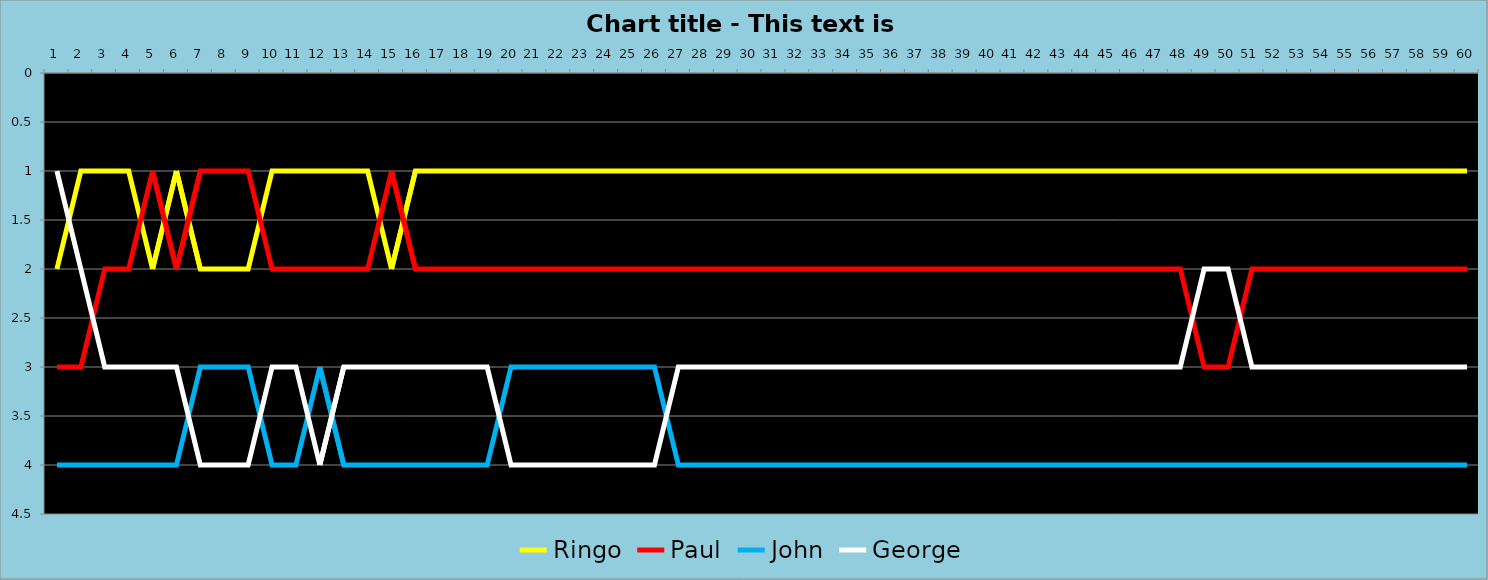
| Category | Ringo | Paul | John | George |
|---|---|---|---|---|
| 0 | 2 | 3 | 4 | 1 |
| 1 | 1 | 3 | 4 | 2 |
| 2 | 1 | 2 | 4 | 3 |
| 3 | 1 | 2 | 4 | 3 |
| 4 | 2 | 1 | 4 | 3 |
| 5 | 1 | 2 | 4 | 3 |
| 6 | 2 | 1 | 3 | 4 |
| 7 | 2 | 1 | 3 | 4 |
| 8 | 2 | 1 | 3 | 4 |
| 9 | 1 | 2 | 4 | 3 |
| 10 | 1 | 2 | 4 | 3 |
| 11 | 1 | 2 | 3 | 4 |
| 12 | 1 | 2 | 4 | 3 |
| 13 | 1 | 2 | 4 | 3 |
| 14 | 2 | 1 | 4 | 3 |
| 15 | 1 | 2 | 4 | 3 |
| 16 | 1 | 2 | 4 | 3 |
| 17 | 1 | 2 | 4 | 3 |
| 18 | 1 | 2 | 4 | 3 |
| 19 | 1 | 2 | 3 | 4 |
| 20 | 1 | 2 | 3 | 4 |
| 21 | 1 | 2 | 3 | 4 |
| 22 | 1 | 2 | 3 | 4 |
| 23 | 1 | 2 | 3 | 4 |
| 24 | 1 | 2 | 3 | 4 |
| 25 | 1 | 2 | 3 | 4 |
| 26 | 1 | 2 | 4 | 3 |
| 27 | 1 | 2 | 4 | 3 |
| 28 | 1 | 2 | 4 | 3 |
| 29 | 1 | 2 | 4 | 3 |
| 30 | 1 | 2 | 4 | 3 |
| 31 | 1 | 2 | 4 | 3 |
| 32 | 1 | 2 | 4 | 3 |
| 33 | 1 | 2 | 4 | 3 |
| 34 | 1 | 2 | 4 | 3 |
| 35 | 1 | 2 | 4 | 3 |
| 36 | 1 | 2 | 4 | 3 |
| 37 | 1 | 2 | 4 | 3 |
| 38 | 1 | 2 | 4 | 3 |
| 39 | 1 | 2 | 4 | 3 |
| 40 | 1 | 2 | 4 | 3 |
| 41 | 1 | 2 | 4 | 3 |
| 42 | 1 | 2 | 4 | 3 |
| 43 | 1 | 2 | 4 | 3 |
| 44 | 1 | 2 | 4 | 3 |
| 45 | 1 | 2 | 4 | 3 |
| 46 | 1 | 2 | 4 | 3 |
| 47 | 1 | 2 | 4 | 3 |
| 48 | 1 | 3 | 4 | 2 |
| 49 | 1 | 3 | 4 | 2 |
| 50 | 1 | 2 | 4 | 3 |
| 51 | 1 | 2 | 4 | 3 |
| 52 | 1 | 2 | 4 | 3 |
| 53 | 1 | 2 | 4 | 3 |
| 54 | 1 | 2 | 4 | 3 |
| 55 | 1 | 2 | 4 | 3 |
| 56 | 1 | 2 | 4 | 3 |
| 57 | 1 | 2 | 4 | 3 |
| 58 | 1 | 2 | 4 | 3 |
| 59 | 1 | 2 | 4 | 3 |